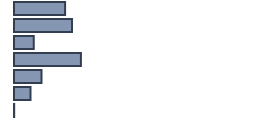
| Category | Percentatge |
|---|---|
| 0 | 21.288 |
| 1 | 24.167 |
| 2 | 8.258 |
| 3 | 27.879 |
| 4 | 11.439 |
| 5 | 6.894 |
| 6 | 0.076 |